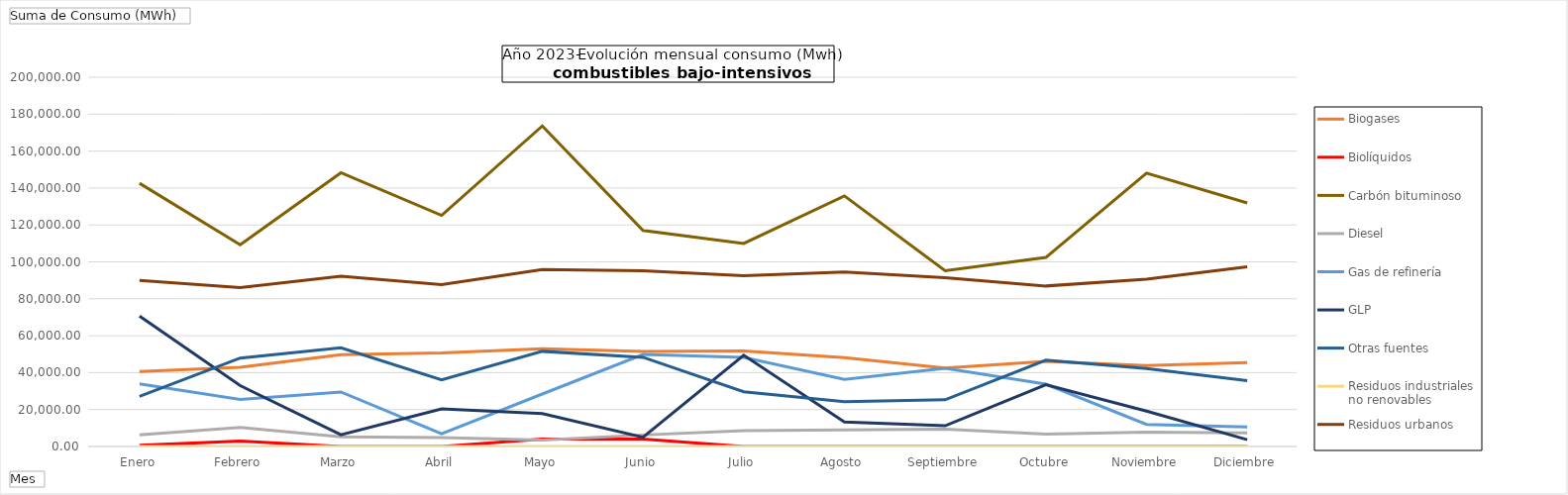
| Category | Biogases | Biolíquidos | Carbón bituminoso | Diesel | Gas de refinería | GLP | Otras fuentes | Residuos industriales no renovables | Residuos urbanos |
|---|---|---|---|---|---|---|---|---|---|
| Enero | 40679.62 | 611.97 | 142556.38 | 6332.64 | 33860 | 70607.36 | 27154.52 | 0 | 89966.49 |
| Febrero | 42865.9 | 2953.38 | 109280.86 | 10288.46 | 25443 | 32959.85 | 47909.75 | 0 | 86085.96 |
| Marzo | 49786.36 | 0 | 148270 | 5202.76 | 29513 | 6327.77 | 53479.11 | 0 | 92267.72 |
| Abril | 50658.05 | 0 | 125166.02 | 4811.87 | 6892 | 20357.12 | 36049.1 | 0 | 87696.06 |
| Mayo | 52949.78 | 4018.06 | 173603.26 | 3496.9 | 28412 | 17809 | 51535.28 | 0 | 95828.95 |
| Junio | 51497.11 | 3977.22 | 117000.86 | 6232.83 | 49838 | 5023 | 48314.79 | 0 | 95202.79 |
| Julio | 51804.57 | 0 | 109960.05 | 8620.72 | 48251.76 | 49449.14 | 29623.65 | 0 | 92511.26 |
| Agosto | 48089.77 | 0 | 135719.23 | 9046.67 | 36295 | 13214.26 | 24310 | 0 | 94474.42 |
| Septiembre | 42480.52 | 0 | 95182.21 | 9431.23 | 42343 | 11200.76 | 25291.48 | 0 | 91410.72 |
| Octubre | 46046.26 | 0 | 102363.32 | 6655.56 | 33779 | 33469.7 | 46791.5 | 0 | 86932.31 |
| Noviembre | 43786.68 | 0 | 148026.29 | 7787.36 | 11952 | 19174.12 | 42233.7 | 0 | 90619.18 |
| Diciembre | 45444.66 | 0 | 131898.44 | 7407.34 | 10639 | 3709 | 35603.84 | 0 | 97360.98 |